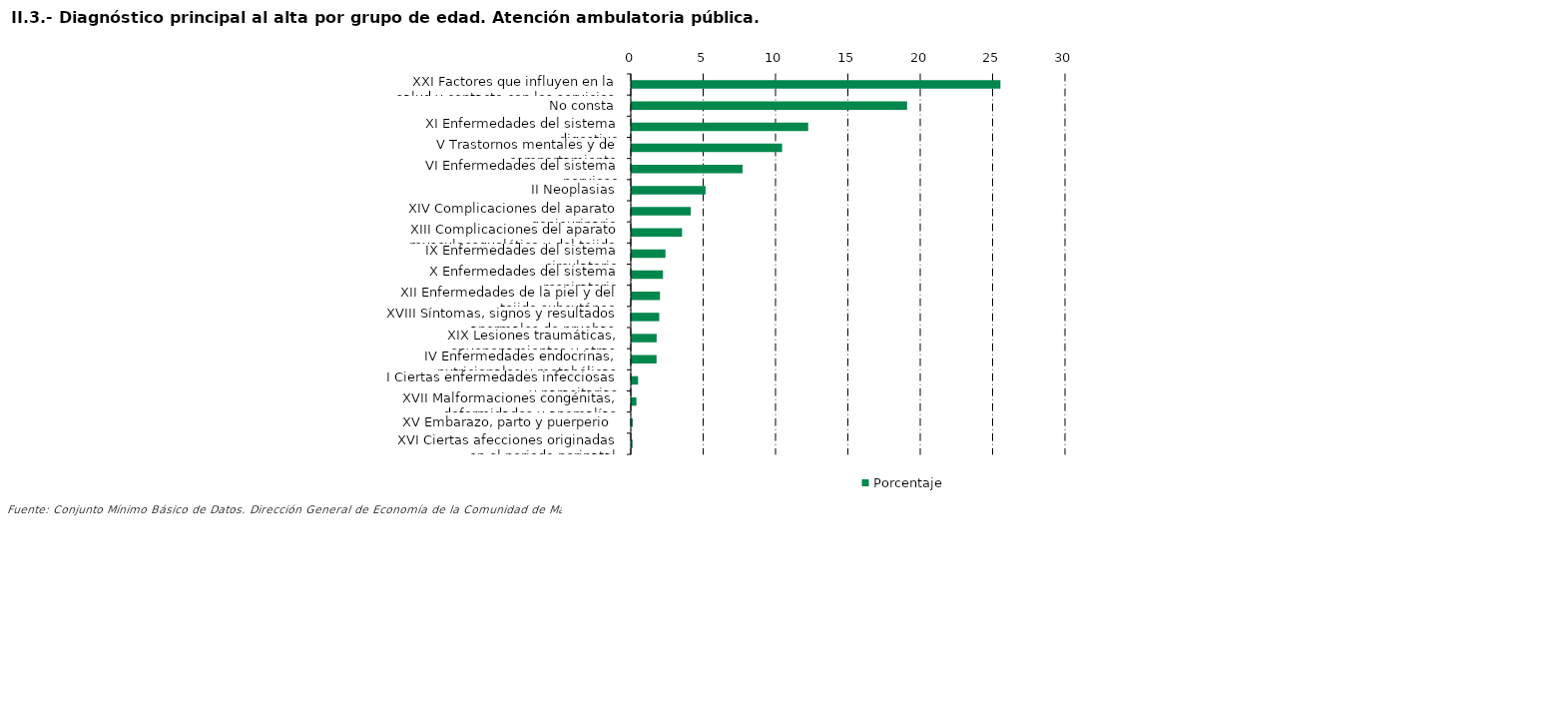
| Category | Porcentaje |
|---|---|
| XXI Factores que influyen en la salud y contacto con los servicios sanitarios | 25.472 |
| No consta | 19.022 |
| XI Enfermedades del sistema digestivo | 12.189 |
| V Trastornos mentales y de comportamiento | 10.387 |
| VI Enfermedades del sistema nervioso | 7.653 |
| II Neoplasias | 5.098 |
| XIV Complicaciones del aparato geniourinario | 4.079 |
| XIII Complicaciones del aparato musculoesquelético y del tejido conectivo | 3.474 |
| IX Enfermedades del sistema circulatorio | 2.326 |
| X Enfermedades del sistema respiratorio | 2.156 |
| XII Enfermedades de la piel y del tejido subcutáneo | 1.947 |
| XVIII Síntomas, signos y resultados anormales de pruebas complementarias, no clasificados bajo otro concepto | 1.896 |
| XIX Lesiones traumáticas, envenenamientos y otras consecuencias de causas externas | 1.717 |
| IV Enfermedades endocrinas, nutricionales y metabólicas | 1.71 |
| I Ciertas enfermedades infecciosas y parasitarias | 0.434 |
| XVII Malformaciones congénitas, deformidades y anomalías cromosómicas | 0.32 |
| XV Embarazo, parto y puerperio | 0.065 |
| XVI Ciertas afecciones originadas en el periodo perinatal | 0.054 |